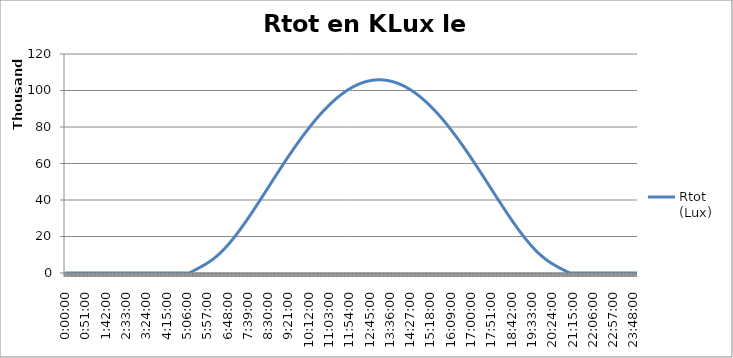
| Category | Rtot
(Lux) |
|---|---|
| 0.0 | 0 |
| 0.0006944444444444445 | 0 |
| 0.001388888888888889 | 0 |
| 0.0020833333333333333 | 0 |
| 0.002777777777777778 | 0 |
| 0.0034722222222222225 | 0 |
| 0.004166666666666667 | 0 |
| 0.004861111111111111 | 0 |
| 0.005555555555555556 | 0 |
| 0.00625 | 0 |
| 0.006944444444444445 | 0 |
| 0.0076388888888888895 | 0 |
| 0.008333333333333333 | 0 |
| 0.009027777777777777 | 0 |
| 0.00972222222222222 | 0 |
| 0.010416666666666664 | 0 |
| 0.011111111111111108 | 0 |
| 0.011805555555555552 | 0 |
| 0.012499999999999995 | 0 |
| 0.01319444444444444 | 0 |
| 0.013888888888888883 | 0 |
| 0.014583333333333327 | 0 |
| 0.01527777777777777 | 0 |
| 0.015972222222222214 | 0 |
| 0.01666666666666666 | 0 |
| 0.017361111111111105 | 0 |
| 0.01805555555555555 | 0 |
| 0.018749999999999996 | 0 |
| 0.01944444444444444 | 0 |
| 0.020138888888888887 | 0 |
| 0.020833333333333332 | 0 |
| 0.021527777777777778 | 0 |
| 0.022222222222222223 | 0 |
| 0.02291666666666667 | 0 |
| 0.023611111111111114 | 0 |
| 0.02430555555555556 | 0 |
| 0.025000000000000005 | 0 |
| 0.02569444444444445 | 0 |
| 0.026388888888888896 | 0 |
| 0.02708333333333334 | 0 |
| 0.027777777777777787 | 0 |
| 0.028472222222222232 | 0 |
| 0.029166666666666678 | 0 |
| 0.029861111111111123 | 0 |
| 0.03055555555555557 | 0 |
| 0.031250000000000014 | 0 |
| 0.031944444444444456 | 0 |
| 0.0326388888888889 | 0 |
| 0.03333333333333334 | 0 |
| 0.03402777777777778 | 0 |
| 0.034722222222222224 | 0 |
| 0.035416666666666666 | 0 |
| 0.03611111111111111 | 0 |
| 0.03680555555555555 | 0 |
| 0.03749999999999999 | 0 |
| 0.038194444444444434 | 0 |
| 0.038888888888888876 | 0 |
| 0.03958333333333332 | 0 |
| 0.04027777777777776 | 0 |
| 0.0409722222222222 | 0 |
| 0.041666666666666644 | 0 |
| 0.042361111111111086 | 0 |
| 0.04305555555555553 | 0 |
| 0.04374999999999997 | 0 |
| 0.04444444444444441 | 0 |
| 0.04513888888888885 | 0 |
| 0.045833333333333295 | 0 |
| 0.04652777777777774 | 0 |
| 0.04722222222222218 | 0 |
| 0.04791666666666662 | 0 |
| 0.04861111111111106 | 0 |
| 0.049305555555555505 | 0 |
| 0.04999999999999995 | 0 |
| 0.05069444444444439 | 0 |
| 0.05138888888888883 | 0 |
| 0.05208333333333327 | 0 |
| 0.052777777777777715 | 0 |
| 0.05347222222222216 | 0 |
| 0.0541666666666666 | 0 |
| 0.05486111111111104 | 0 |
| 0.05555555555555548 | 0 |
| 0.056249999999999925 | 0 |
| 0.05694444444444437 | 0 |
| 0.05763888888888881 | 0 |
| 0.05833333333333325 | 0 |
| 0.05902777777777769 | 0 |
| 0.059722222222222135 | 0 |
| 0.06041666666666658 | 0 |
| 0.06111111111111102 | 0 |
| 0.06180555555555546 | 0 |
| 0.0624999999999999 | 0 |
| 0.06319444444444434 | 0 |
| 0.06388888888888879 | 0 |
| 0.06458333333333323 | 0 |
| 0.06527777777777767 | 0 |
| 0.06597222222222211 | 0 |
| 0.06666666666666655 | 0 |
| 0.067361111111111 | 0 |
| 0.06805555555555544 | 0 |
| 0.06874999999999988 | 0 |
| 0.06944444444444432 | 0 |
| 0.07013888888888876 | 0 |
| 0.0708333333333332 | 0 |
| 0.07152777777777765 | 0 |
| 0.07222222222222209 | 0 |
| 0.07291666666666653 | 0 |
| 0.07361111111111097 | 0 |
| 0.07430555555555542 | 0 |
| 0.07499999999999986 | 0 |
| 0.0756944444444443 | 0 |
| 0.07638888888888874 | 0 |
| 0.07708333333333318 | 0 |
| 0.07777777777777763 | 0 |
| 0.07847222222222207 | 0 |
| 0.07916666666666651 | 0 |
| 0.07986111111111095 | 0 |
| 0.0805555555555554 | 0 |
| 0.08124999999999984 | 0 |
| 0.08194444444444428 | 0 |
| 0.08263888888888872 | 0 |
| 0.08333333333333316 | 0 |
| 0.0840277777777776 | 0 |
| 0.08472222222222205 | 0 |
| 0.08541666666666649 | 0 |
| 0.08611111111111093 | 0 |
| 0.08680555555555537 | 0 |
| 0.08749999999999981 | 0 |
| 0.08819444444444426 | 0 |
| 0.0888888888888887 | 0 |
| 0.08958333333333314 | 0 |
| 0.09027777777777758 | 0 |
| 0.09097222222222202 | 0 |
| 0.09166666666666647 | 0 |
| 0.09236111111111091 | 0 |
| 0.09305555555555535 | 0 |
| 0.09374999999999979 | 0 |
| 0.09444444444444423 | 0 |
| 0.09513888888888868 | 0 |
| 0.09583333333333312 | 0 |
| 0.09652777777777756 | 0 |
| 0.097222222222222 | 0 |
| 0.09791666666666644 | 0 |
| 0.09861111111111089 | 0 |
| 0.09930555555555533 | 0 |
| 0.09999999999999977 | 0 |
| 0.10069444444444421 | 0 |
| 0.10138888888888865 | 0 |
| 0.1020833333333331 | 0 |
| 0.10277777777777754 | 0 |
| 0.10347222222222198 | 0 |
| 0.10416666666666642 | 0 |
| 0.10486111111111086 | 0 |
| 0.1055555555555553 | 0 |
| 0.10624999999999975 | 0 |
| 0.10694444444444419 | 0 |
| 0.10763888888888863 | 0 |
| 0.10833333333333307 | 0 |
| 0.10902777777777752 | 0 |
| 0.10972222222222196 | 0 |
| 0.1104166666666664 | 0 |
| 0.11111111111111084 | 0 |
| 0.11180555555555528 | 0 |
| 0.11249999999999973 | 0 |
| 0.11319444444444417 | 0 |
| 0.11388888888888861 | 0 |
| 0.11458333333333305 | 0 |
| 0.1152777777777775 | 0 |
| 0.11597222222222194 | 0 |
| 0.11666666666666638 | 0 |
| 0.11736111111111082 | 0 |
| 0.11805555555555526 | 0 |
| 0.1187499999999997 | 0 |
| 0.11944444444444414 | 0 |
| 0.12013888888888859 | 0 |
| 0.12083333333333303 | 0 |
| 0.12152777777777747 | 0 |
| 0.12222222222222191 | 0 |
| 0.12291666666666635 | 0 |
| 0.1236111111111108 | 0 |
| 0.12430555555555524 | 0 |
| 0.12499999999999968 | 0 |
| 0.12569444444444414 | 0 |
| 0.12638888888888858 | 0 |
| 0.12708333333333302 | 0 |
| 0.12777777777777746 | 0 |
| 0.1284722222222219 | 0 |
| 0.12916666666666635 | 0 |
| 0.1298611111111108 | 0 |
| 0.13055555555555523 | 0 |
| 0.13124999999999967 | 0 |
| 0.13194444444444411 | 0 |
| 0.13263888888888856 | 0 |
| 0.133333333333333 | 0 |
| 0.13402777777777744 | 0 |
| 0.13472222222222188 | 0 |
| 0.13541666666666632 | 0 |
| 0.13611111111111077 | 0 |
| 0.1368055555555552 | 0 |
| 0.13749999999999965 | 0 |
| 0.1381944444444441 | 0 |
| 0.13888888888888853 | 0 |
| 0.13958333333333298 | 0 |
| 0.14027777777777742 | 0 |
| 0.14097222222222186 | 0 |
| 0.1416666666666663 | 0 |
| 0.14236111111111074 | 0 |
| 0.14305555555555519 | 0 |
| 0.14374999999999963 | 0 |
| 0.14444444444444407 | 0 |
| 0.1451388888888885 | 0 |
| 0.14583333333333295 | 0 |
| 0.1465277777777774 | 0 |
| 0.14722222222222184 | 0 |
| 0.14791666666666628 | 0 |
| 0.14861111111111072 | 0 |
| 0.14930555555555516 | 0 |
| 0.1499999999999996 | 0 |
| 0.15069444444444405 | 0 |
| 0.1513888888888885 | 0 |
| 0.15208333333333293 | 0 |
| 0.15277777777777737 | 0 |
| 0.15347222222222182 | 0 |
| 0.15416666666666626 | 0 |
| 0.1548611111111107 | 0 |
| 0.15555555555555514 | 0 |
| 0.15624999999999958 | 0 |
| 0.15694444444444403 | 0 |
| 0.15763888888888847 | 0 |
| 0.1583333333333329 | 0 |
| 0.15902777777777735 | 0 |
| 0.1597222222222218 | 0 |
| 0.16041666666666624 | 0 |
| 0.16111111111111068 | 0 |
| 0.16180555555555512 | 0 |
| 0.16249999999999956 | 0 |
| 0.163194444444444 | 0 |
| 0.16388888888888845 | 0 |
| 0.1645833333333329 | 0 |
| 0.16527777777777733 | 0 |
| 0.16597222222222177 | 0 |
| 0.1666666666666662 | 0 |
| 0.16736111111111066 | 0 |
| 0.1680555555555551 | 0 |
| 0.16874999999999954 | 0 |
| 0.16944444444444398 | 0 |
| 0.17013888888888842 | 0 |
| 0.17083333333333287 | 0 |
| 0.1715277777777773 | 0 |
| 0.17222222222222175 | 0 |
| 0.1729166666666662 | 0 |
| 0.17361111111111063 | 0 |
| 0.17430555555555508 | 0 |
| 0.17499999999999952 | 0 |
| 0.17569444444444396 | 0 |
| 0.1763888888888884 | 0 |
| 0.17708333333333284 | 0 |
| 0.17777777777777728 | 0 |
| 0.17847222222222173 | 0 |
| 0.17916666666666617 | 0 |
| 0.1798611111111106 | 0 |
| 0.18055555555555505 | 0 |
| 0.1812499999999995 | 0 |
| 0.18194444444444394 | 0 |
| 0.18263888888888838 | 0 |
| 0.18333333333333282 | 0 |
| 0.18402777777777726 | 0 |
| 0.1847222222222217 | 0 |
| 0.18541666666666615 | 0 |
| 0.1861111111111106 | 0 |
| 0.18680555555555503 | 0 |
| 0.18749999999999947 | 0 |
| 0.18819444444444391 | 0 |
| 0.18888888888888836 | 0 |
| 0.1895833333333328 | 0 |
| 0.19027777777777724 | 0 |
| 0.19097222222222168 | 0 |
| 0.19166666666666612 | 0 |
| 0.19236111111111057 | 0 |
| 0.193055555555555 | 0 |
| 0.19374999999999945 | 0 |
| 0.1944444444444439 | 0 |
| 0.19513888888888833 | 0 |
| 0.19583333333333278 | 0 |
| 0.19652777777777722 | 0 |
| 0.19722222222222166 | 0 |
| 0.1979166666666661 | 0 |
| 0.19861111111111054 | 0 |
| 0.199305555555555 | 0 |
| 0.19999999999999943 | 0 |
| 0.20069444444444387 | 0 |
| 0.2013888888888883 | 0 |
| 0.20208333333333275 | 0 |
| 0.2027777777777772 | 0 |
| 0.20347222222222164 | 0 |
| 0.20416666666666608 | 0 |
| 0.20486111111111052 | 0 |
| 0.20555555555555496 | 0 |
| 0.2062499999999994 | 0 |
| 0.20694444444444385 | 0 |
| 0.2076388888888883 | 0 |
| 0.20833333333333273 | 0 |
| 0.20902777777777717 | 0 |
| 0.20972222222222162 | 0 |
| 0.21041666666666606 | 0 |
| 0.2111111111111105 | 0 |
| 0.21180555555555494 | 0 |
| 0.21249999999999938 | 0 |
| 0.21319444444444383 | 0 |
| 0.21388888888888827 | 0 |
| 0.2145833333333327 | 0 |
| 0.21527777777777715 | 0 |
| 0.2159722222222216 | 0 |
| 0.21666666666666604 | 86.975 |
| 0.21736111111111048 | 195.812 |
| 0.21805555555555492 | 304.914 |
| 0.21874999999999936 | 414.279 |
| 0.2194444444444438 | 523.903 |
| 0.22013888888888825 | 633.787 |
| 0.2208333333333327 | 743.927 |
| 0.22152777777777713 | 854.322 |
| 0.22222222222222157 | 964.97 |
| 0.222916666666666 | 1075.871 |
| 0.22361111111111046 | 1187.025 |
| 0.2243055555555549 | 1298.43 |
| 0.22499999999999934 | 1410.089 |
| 0.22569444444444378 | 1522.004 |
| 0.22638888888888822 | 1634.18 |
| 0.22708333333333267 | 1746.62 |
| 0.2277777777777771 | 1859.335 |
| 0.22847222222222155 | 1972.334 |
| 0.229166666666666 | 2085.63 |
| 0.22986111111111043 | 2199.24 |
| 0.23055555555555488 | 2313.183 |
| 0.23124999999999932 | 2427.483 |
| 0.23194444444444376 | 2542.166 |
| 0.2326388888888882 | 2657.262 |
| 0.23333333333333264 | 2772.806 |
| 0.23402777777777709 | 2888.836 |
| 0.23472222222222153 | 3005.392 |
| 0.23541666666666597 | 3122.519 |
| 0.2361111111111104 | 3240.265 |
| 0.23680555555555485 | 3358.681 |
| 0.2374999999999993 | 3477.82 |
| 0.23819444444444374 | 3597.738 |
| 0.23888888888888818 | 3718.491 |
| 0.23958333333333262 | 3840.139 |
| 0.24027777777777706 | 3962.742 |
| 0.2409722222222215 | 4086.361 |
| 0.24166666666666595 | 4211.059 |
| 0.2423611111111104 | 4336.897 |
| 0.24305555555555483 | 4463.937 |
| 0.24374999999999927 | 4592.24 |
| 0.24444444444444371 | 4721.868 |
| 0.24513888888888816 | 4852.88 |
| 0.2458333333333326 | 4985.335 |
| 0.24652777777777704 | 5119.291 |
| 0.24722222222222148 | 5254.804 |
| 0.24791666666666592 | 5391.928 |
| 0.24861111111111037 | 5530.715 |
| 0.2493055555555548 | 5671.217 |
| 0.24999999999999925 | 5813.48 |
| 0.2506944444444437 | 5957.553 |
| 0.25138888888888816 | 6103.478 |
| 0.2520833333333326 | 6251.298 |
| 0.25277777777777705 | 6401.053 |
| 0.2534722222222215 | 6552.779 |
| 0.25416666666666593 | 6706.511 |
| 0.25486111111111037 | 6862.283 |
| 0.2555555555555548 | 7020.125 |
| 0.25624999999999926 | 7180.065 |
| 0.2569444444444437 | 7342.129 |
| 0.25763888888888814 | 7506.34 |
| 0.2583333333333326 | 7672.72 |
| 0.259027777777777 | 7841.289 |
| 0.25972222222222147 | 8012.064 |
| 0.2604166666666659 | 8185.06 |
| 0.26111111111111035 | 8360.29 |
| 0.2618055555555548 | 8537.768 |
| 0.26249999999999923 | 8717.501 |
| 0.2631944444444437 | 8899.498 |
| 0.2638888888888881 | 9083.766 |
| 0.26458333333333256 | 9270.308 |
| 0.265277777777777 | 9459.129 |
| 0.26597222222222144 | 9650.229 |
| 0.2666666666666659 | 9843.608 |
| 0.26736111111111033 | 10039.267 |
| 0.26805555555555477 | 10237.201 |
| 0.2687499999999992 | 10437.406 |
| 0.26944444444444365 | 10639.879 |
| 0.2701388888888881 | 10844.613 |
| 0.27083333333333254 | 11051.599 |
| 0.271527777777777 | 11260.831 |
| 0.2722222222222214 | 11472.298 |
| 0.27291666666666586 | 11685.991 |
| 0.2736111111111103 | 11901.898 |
| 0.27430555555555475 | 12120.007 |
| 0.2749999999999992 | 12340.306 |
| 0.27569444444444363 | 12562.781 |
| 0.2763888888888881 | 12787.417 |
| 0.2770833333333325 | 13014.201 |
| 0.27777777777777696 | 13243.115 |
| 0.2784722222222214 | 13474.145 |
| 0.27916666666666584 | 13707.273 |
| 0.2798611111111103 | 13942.483 |
| 0.2805555555555547 | 14179.757 |
| 0.28124999999999917 | 14419.076 |
| 0.2819444444444436 | 14660.423 |
| 0.28263888888888805 | 14903.777 |
| 0.2833333333333325 | 15149.121 |
| 0.28402777777777694 | 15396.435 |
| 0.2847222222222214 | 15645.698 |
| 0.2854166666666658 | 15896.89 |
| 0.28611111111111026 | 16149.992 |
| 0.2868055555555547 | 16404.982 |
| 0.28749999999999915 | 16661.839 |
| 0.2881944444444436 | 16920.542 |
| 0.28888888888888803 | 17181.071 |
| 0.28958333333333247 | 17443.404 |
| 0.2902777777777769 | 17707.518 |
| 0.29097222222222136 | 17973.393 |
| 0.2916666666666658 | 18241.007 |
| 0.29236111111111024 | 18510.338 |
| 0.2930555555555547 | 18781.363 |
| 0.2937499999999991 | 19054.061 |
| 0.29444444444444356 | 19328.41 |
| 0.295138888888888 | 19604.387 |
| 0.29583333333333245 | 19881.97 |
| 0.2965277777777769 | 20161.137 |
| 0.29722222222222133 | 20441.867 |
| 0.2979166666666658 | 20724.136 |
| 0.2986111111111102 | 21007.922 |
| 0.29930555555555466 | 21293.203 |
| 0.2999999999999991 | 21579.957 |
| 0.30069444444444354 | 21868.163 |
| 0.301388888888888 | 22157.796 |
| 0.3020833333333324 | 22448.836 |
| 0.30277777777777687 | 22741.261 |
| 0.3034722222222213 | 23035.048 |
| 0.30416666666666575 | 23330.176 |
| 0.3048611111111102 | 23626.622 |
| 0.30555555555555464 | 23924.365 |
| 0.3062499999999991 | 24223.383 |
| 0.3069444444444435 | 24523.655 |
| 0.30763888888888796 | 24825.158 |
| 0.3083333333333324 | 25127.871 |
| 0.30902777777777685 | 25431.773 |
| 0.3097222222222213 | 25736.843 |
| 0.31041666666666573 | 26043.059 |
| 0.3111111111111102 | 26350.4 |
| 0.3118055555555546 | 26658.845 |
| 0.31249999999999906 | 26968.373 |
| 0.3131944444444435 | 27278.963 |
| 0.31388888888888794 | 27590.595 |
| 0.3145833333333324 | 27903.247 |
| 0.3152777777777768 | 28216.899 |
| 0.31597222222222127 | 28531.531 |
| 0.3166666666666657 | 28847.123 |
| 0.31736111111111015 | 29163.653 |
| 0.3180555555555546 | 29481.103 |
| 0.31874999999999903 | 29799.451 |
| 0.3194444444444435 | 30118.678 |
| 0.3201388888888879 | 30438.765 |
| 0.32083333333333236 | 30759.692 |
| 0.3215277777777768 | 31081.438 |
| 0.32222222222222124 | 31403.985 |
| 0.3229166666666657 | 31727.313 |
| 0.32361111111111013 | 32051.403 |
| 0.32430555555555457 | 32376.236 |
| 0.324999999999999 | 32701.793 |
| 0.32569444444444345 | 33028.054 |
| 0.3263888888888879 | 33355.002 |
| 0.32708333333333234 | 33682.617 |
| 0.3277777777777768 | 34010.882 |
| 0.3284722222222212 | 34339.776 |
| 0.32916666666666566 | 34669.283 |
| 0.3298611111111101 | 34999.384 |
| 0.33055555555555455 | 35330.061 |
| 0.331249999999999 | 35661.296 |
| 0.33194444444444343 | 35993.071 |
| 0.3326388888888879 | 36325.367 |
| 0.3333333333333323 | 36658.169 |
| 0.33402777777777676 | 36991.457 |
| 0.3347222222222212 | 37325.216 |
| 0.33541666666666564 | 37659.426 |
| 0.3361111111111101 | 37994.071 |
| 0.3368055555555545 | 38329.134 |
| 0.33749999999999897 | 38664.599 |
| 0.3381944444444434 | 39000.447 |
| 0.33888888888888785 | 39336.662 |
| 0.3395833333333323 | 39673.228 |
| 0.34027777777777674 | 40010.128 |
| 0.3409722222222212 | 40347.345 |
| 0.3416666666666656 | 40684.863 |
| 0.34236111111111006 | 41022.667 |
| 0.3430555555555545 | 41360.738 |
| 0.34374999999999895 | 41699.063 |
| 0.3444444444444434 | 42037.623 |
| 0.34513888888888783 | 42376.405 |
| 0.34583333333333227 | 42715.391 |
| 0.3465277777777767 | 43054.567 |
| 0.34722222222222116 | 43393.916 |
| 0.3479166666666656 | 43733.424 |
| 0.34861111111111004 | 44073.074 |
| 0.3493055555555545 | 44412.852 |
| 0.3499999999999989 | 44752.742 |
| 0.35069444444444337 | 45092.729 |
| 0.3513888888888878 | 45432.799 |
| 0.35208333333333225 | 45772.936 |
| 0.3527777777777767 | 46113.125 |
| 0.35347222222222113 | 46453.352 |
| 0.3541666666666656 | 46793.602 |
| 0.35486111111111 | 47133.86 |
| 0.35555555555555446 | 47474.113 |
| 0.3562499999999989 | 47814.345 |
| 0.35694444444444334 | 48154.542 |
| 0.3576388888888878 | 48494.691 |
| 0.3583333333333322 | 48834.776 |
| 0.35902777777777667 | 49174.785 |
| 0.3597222222222211 | 49514.703 |
| 0.36041666666666555 | 49854.516 |
| 0.36111111111111 | 50194.21 |
| 0.36180555555555444 | 50533.772 |
| 0.3624999999999989 | 50873.188 |
| 0.3631944444444433 | 51212.445 |
| 0.36388888888888776 | 51551.528 |
| 0.3645833333333322 | 51890.426 |
| 0.36527777777777665 | 52229.124 |
| 0.3659722222222211 | 52567.609 |
| 0.36666666666666553 | 52905.868 |
| 0.36736111111111 | 53243.888 |
| 0.3680555555555544 | 53581.656 |
| 0.36874999999999886 | 53919.159 |
| 0.3694444444444433 | 54256.385 |
| 0.37013888888888774 | 54593.32 |
| 0.3708333333333322 | 54929.952 |
| 0.3715277777777766 | 55266.268 |
| 0.37222222222222107 | 55602.255 |
| 0.3729166666666655 | 55937.902 |
| 0.37361111111110995 | 56273.196 |
| 0.3743055555555544 | 56608.125 |
| 0.37499999999999883 | 56942.675 |
| 0.3756944444444433 | 57276.836 |
| 0.3763888888888877 | 57610.595 |
| 0.37708333333333216 | 57943.94 |
| 0.3777777777777766 | 58276.858 |
| 0.37847222222222104 | 58609.339 |
| 0.3791666666666655 | 58941.37 |
| 0.37986111111110993 | 59272.94 |
| 0.38055555555555437 | 59604.037 |
| 0.3812499999999988 | 59934.648 |
| 0.38194444444444325 | 60264.764 |
| 0.3826388888888877 | 60594.371 |
| 0.38333333333333214 | 60923.46 |
| 0.3840277777777766 | 61252.017 |
| 0.384722222222221 | 61580.033 |
| 0.38541666666666546 | 61907.496 |
| 0.3861111111111099 | 62234.394 |
| 0.38680555555555435 | 62560.717 |
| 0.3874999999999988 | 62886.453 |
| 0.38819444444444323 | 63211.592 |
| 0.3888888888888877 | 63536.123 |
| 0.3895833333333321 | 63860.034 |
| 0.39027777777777656 | 64183.316 |
| 0.390972222222221 | 64505.957 |
| 0.39166666666666544 | 64827.946 |
| 0.3923611111111099 | 65149.273 |
| 0.3930555555555543 | 65469.928 |
| 0.39374999999999877 | 65789.9 |
| 0.3944444444444432 | 66109.178 |
| 0.39513888888888765 | 66427.753 |
| 0.3958333333333321 | 66745.613 |
| 0.39652777777777654 | 67062.749 |
| 0.397222222222221 | 67379.151 |
| 0.3979166666666654 | 67694.807 |
| 0.39861111111110986 | 68009.709 |
| 0.3993055555555543 | 68323.846 |
| 0.39999999999999875 | 68637.209 |
| 0.4006944444444432 | 68949.786 |
| 0.40138888888888763 | 69261.57 |
| 0.40208333333333207 | 69572.548 |
| 0.4027777777777765 | 69882.713 |
| 0.40347222222222096 | 70192.054 |
| 0.4041666666666654 | 70500.562 |
| 0.40486111111110984 | 70808.227 |
| 0.4055555555555543 | 71115.039 |
| 0.4062499999999987 | 71420.99 |
| 0.40694444444444317 | 71726.069 |
| 0.4076388888888876 | 72030.267 |
| 0.40833333333333205 | 72333.576 |
| 0.4090277777777765 | 72635.985 |
| 0.40972222222222093 | 72937.486 |
| 0.4104166666666654 | 73238.07 |
| 0.4111111111111098 | 73537.727 |
| 0.41180555555555426 | 73836.448 |
| 0.4124999999999987 | 74134.224 |
| 0.41319444444444314 | 74431.047 |
| 0.4138888888888876 | 74726.908 |
| 0.414583333333332 | 75021.797 |
| 0.41527777777777647 | 75315.707 |
| 0.4159722222222209 | 75608.627 |
| 0.41666666666666535 | 75900.551 |
| 0.4173611111111098 | 76191.468 |
| 0.41805555555555424 | 76481.371 |
| 0.4187499999999987 | 76770.25 |
| 0.4194444444444431 | 77058.098 |
| 0.42013888888888756 | 77344.906 |
| 0.420833333333332 | 77630.666 |
| 0.42152777777777645 | 77915.369 |
| 0.4222222222222209 | 78199.008 |
| 0.42291666666666533 | 78481.573 |
| 0.4236111111111098 | 78763.057 |
| 0.4243055555555542 | 79043.451 |
| 0.42499999999999866 | 79322.748 |
| 0.4256944444444431 | 79600.94 |
| 0.42638888888888754 | 79878.018 |
| 0.427083333333332 | 80153.975 |
| 0.4277777777777764 | 80428.803 |
| 0.42847222222222087 | 80702.494 |
| 0.4291666666666653 | 80975.04 |
| 0.42986111111110975 | 81246.433 |
| 0.4305555555555542 | 81516.666 |
| 0.43124999999999863 | 81785.732 |
| 0.4319444444444431 | 82053.622 |
| 0.4326388888888875 | 82320.329 |
| 0.43333333333333196 | 82585.846 |
| 0.4340277777777764 | 82850.165 |
| 0.43472222222222084 | 83113.279 |
| 0.4354166666666653 | 83375.181 |
| 0.43611111111110973 | 83635.863 |
| 0.43680555555555417 | 83895.317 |
| 0.4374999999999986 | 84153.538 |
| 0.43819444444444305 | 84410.517 |
| 0.4388888888888875 | 84666.247 |
| 0.43958333333333194 | 84920.723 |
| 0.4402777777777764 | 85173.935 |
| 0.4409722222222208 | 85425.878 |
| 0.44166666666666526 | 85676.545 |
| 0.4423611111111097 | 85925.929 |
| 0.44305555555555415 | 86174.022 |
| 0.4437499999999986 | 86420.819 |
| 0.44444444444444303 | 86666.312 |
| 0.4451388888888875 | 86910.494 |
| 0.4458333333333319 | 87153.36 |
| 0.44652777777777636 | 87394.903 |
| 0.4472222222222208 | 87635.116 |
| 0.44791666666666524 | 87873.992 |
| 0.4486111111111097 | 88111.525 |
| 0.4493055555555541 | 88347.709 |
| 0.44999999999999857 | 88582.537 |
| 0.450694444444443 | 88816.003 |
| 0.45138888888888745 | 89048.101 |
| 0.4520833333333319 | 89278.825 |
| 0.45277777777777634 | 89508.168 |
| 0.4534722222222208 | 89736.124 |
| 0.4541666666666652 | 89962.687 |
| 0.45486111111110966 | 90187.852 |
| 0.4555555555555541 | 90411.612 |
| 0.45624999999999855 | 90633.961 |
| 0.456944444444443 | 90854.893 |
| 0.45763888888888743 | 91074.403 |
| 0.45833333333333187 | 91292.484 |
| 0.4590277777777763 | 91509.131 |
| 0.45972222222222076 | 91724.339 |
| 0.4604166666666652 | 91938.101 |
| 0.46111111111110964 | 92150.412 |
| 0.4618055555555541 | 92361.266 |
| 0.4624999999999985 | 92570.658 |
| 0.46319444444444297 | 92778.583 |
| 0.4638888888888874 | 92985.034 |
| 0.46458333333333185 | 93190.006 |
| 0.4652777777777763 | 93393.495 |
| 0.46597222222222073 | 93595.495 |
| 0.4666666666666652 | 93796 |
| 0.4673611111111096 | 93995.005 |
| 0.46805555555555406 | 94192.506 |
| 0.4687499999999985 | 94388.496 |
| 0.46944444444444294 | 94582.972 |
| 0.4701388888888874 | 94775.927 |
| 0.4708333333333318 | 94967.357 |
| 0.47152777777777627 | 95157.257 |
| 0.4722222222222207 | 95345.622 |
| 0.47291666666666515 | 95532.448 |
| 0.4736111111111096 | 95717.728 |
| 0.47430555555555404 | 95901.459 |
| 0.4749999999999985 | 96083.637 |
| 0.4756944444444429 | 96264.255 |
| 0.47638888888888736 | 96443.31 |
| 0.4770833333333318 | 96620.796 |
| 0.47777777777777625 | 96796.71 |
| 0.4784722222222207 | 96971.047 |
| 0.47916666666666513 | 97143.803 |
| 0.4798611111111096 | 97314.972 |
| 0.480555555555554 | 97484.551 |
| 0.48124999999999846 | 97652.535 |
| 0.4819444444444429 | 97818.921 |
| 0.48263888888888734 | 97983.703 |
| 0.4833333333333318 | 98146.878 |
| 0.4840277777777762 | 98308.441 |
| 0.48472222222222067 | 98468.388 |
| 0.4854166666666651 | 98626.716 |
| 0.48611111111110955 | 98783.42 |
| 0.486805555555554 | 98938.496 |
| 0.48749999999999843 | 99091.941 |
| 0.4881944444444429 | 99243.75 |
| 0.4888888888888873 | 99393.92 |
| 0.48958333333333176 | 99542.447 |
| 0.4902777777777762 | 99689.326 |
| 0.49097222222222064 | 99834.555 |
| 0.4916666666666651 | 99978.13 |
| 0.49236111111110953 | 100120.047 |
| 0.49305555555555397 | 100260.302 |
| 0.4937499999999984 | 100398.893 |
| 0.49444444444444285 | 100535.815 |
| 0.4951388888888873 | 100671.065 |
| 0.49583333333333174 | 100804.64 |
| 0.4965277777777762 | 100936.536 |
| 0.4972222222222206 | 101066.75 |
| 0.49791666666666506 | 101195.278 |
| 0.4986111111111095 | 101322.119 |
| 0.49930555555555395 | 101447.267 |
| 0.4999999999999984 | 101570.721 |
| 0.5006944444444429 | 101692.477 |
| 0.5013888888888873 | 101812.533 |
| 0.5020833333333318 | 101930.884 |
| 0.5027777777777762 | 102047.528 |
| 0.5034722222222207 | 102162.463 |
| 0.5041666666666651 | 102275.685 |
| 0.5048611111111095 | 102387.191 |
| 0.505555555555554 | 102496.98 |
| 0.5062499999999984 | 102605.047 |
| 0.5069444444444429 | 102711.391 |
| 0.5076388888888873 | 102816.008 |
| 0.5083333333333317 | 102918.897 |
| 0.5090277777777762 | 103020.054 |
| 0.5097222222222206 | 103119.477 |
| 0.5104166666666651 | 103217.164 |
| 0.5111111111111095 | 103313.111 |
| 0.511805555555554 | 103407.318 |
| 0.5124999999999984 | 103499.781 |
| 0.5131944444444428 | 103590.498 |
| 0.5138888888888873 | 103679.467 |
| 0.5145833333333317 | 103766.686 |
| 0.5152777777777762 | 103852.152 |
| 0.5159722222222206 | 103935.864 |
| 0.516666666666665 | 104017.819 |
| 0.5173611111111095 | 104098.015 |
| 0.5180555555555539 | 104176.451 |
| 0.5187499999999984 | 104253.124 |
| 0.5194444444444428 | 104328.032 |
| 0.5201388888888873 | 104401.175 |
| 0.5208333333333317 | 104472.549 |
| 0.5215277777777761 | 104542.153 |
| 0.5222222222222206 | 104609.985 |
| 0.522916666666665 | 104676.044 |
| 0.5236111111111095 | 104740.329 |
| 0.5243055555555539 | 104802.836 |
| 0.5249999999999984 | 104863.566 |
| 0.5256944444444428 | 104922.516 |
| 0.5263888888888872 | 104979.685 |
| 0.5270833333333317 | 105035.072 |
| 0.5277777777777761 | 105088.675 |
| 0.5284722222222206 | 105140.493 |
| 0.529166666666665 | 105190.524 |
| 0.5298611111111095 | 105238.768 |
| 0.5305555555555539 | 105285.224 |
| 0.5312499999999983 | 105329.889 |
| 0.5319444444444428 | 105372.763 |
| 0.5326388888888872 | 105413.845 |
| 0.5333333333333317 | 105453.134 |
| 0.5340277777777761 | 105490.629 |
| 0.5347222222222205 | 105526.329 |
| 0.535416666666665 | 105560.233 |
| 0.5361111111111094 | 105592.341 |
| 0.5368055555555539 | 105622.651 |
| 0.5374999999999983 | 105651.162 |
| 0.5381944444444428 | 105677.875 |
| 0.5388888888888872 | 105702.788 |
| 0.5395833333333316 | 105725.902 |
| 0.5402777777777761 | 105747.214 |
| 0.5409722222222205 | 105766.725 |
| 0.541666666666665 | 105784.434 |
| 0.5423611111111094 | 105800.341 |
| 0.5430555555555538 | 105814.446 |
| 0.5437499999999983 | 105826.748 |
| 0.5444444444444427 | 105837.246 |
| 0.5451388888888872 | 105845.941 |
| 0.5458333333333316 | 105852.832 |
| 0.5465277777777761 | 105857.92 |
| 0.5472222222222205 | 105861.203 |
| 0.5479166666666649 | 105862.683 |
| 0.5486111111111094 | 105862.358 |
| 0.5493055555555538 | 105860.229 |
| 0.5499999999999983 | 105856.296 |
| 0.5506944444444427 | 105850.559 |
| 0.5513888888888872 | 105843.019 |
| 0.5520833333333316 | 105833.674 |
| 0.552777777777776 | 105822.527 |
| 0.5534722222222205 | 105809.576 |
| 0.5541666666666649 | 105794.823 |
| 0.5548611111111094 | 105778.267 |
| 0.5555555555555538 | 105759.909 |
| 0.5562499999999982 | 105739.749 |
| 0.5569444444444427 | 105717.788 |
| 0.5576388888888871 | 105694.027 |
| 0.5583333333333316 | 105668.466 |
| 0.559027777777776 | 105641.105 |
| 0.5597222222222205 | 105611.946 |
| 0.5604166666666649 | 105580.989 |
| 0.5611111111111093 | 105548.235 |
| 0.5618055555555538 | 105513.684 |
| 0.5624999999999982 | 105477.337 |
| 0.5631944444444427 | 105439.197 |
| 0.5638888888888871 | 105399.262 |
| 0.5645833333333315 | 105357.535 |
| 0.565277777777776 | 105314.016 |
| 0.5659722222222204 | 105268.706 |
| 0.5666666666666649 | 105221.607 |
| 0.5673611111111093 | 105172.719 |
| 0.5680555555555538 | 105122.044 |
| 0.5687499999999982 | 105069.584 |
| 0.5694444444444426 | 105015.338 |
| 0.5701388888888871 | 104959.31 |
| 0.5708333333333315 | 104901.499 |
| 0.571527777777776 | 104841.908 |
| 0.5722222222222204 | 104780.538 |
| 0.5729166666666649 | 104717.391 |
| 0.5736111111111093 | 104652.468 |
| 0.5743055555555537 | 104585.77 |
| 0.5749999999999982 | 104517.299 |
| 0.5756944444444426 | 104447.058 |
| 0.5763888888888871 | 104375.047 |
| 0.5770833333333315 | 104301.269 |
| 0.577777777777776 | 104225.725 |
| 0.5784722222222204 | 104148.417 |
| 0.5791666666666648 | 104069.347 |
| 0.5798611111111093 | 103988.518 |
| 0.5805555555555537 | 103905.93 |
| 0.5812499999999982 | 103821.586 |
| 0.5819444444444426 | 103735.489 |
| 0.582638888888887 | 103647.64 |
| 0.5833333333333315 | 103558.041 |
| 0.5840277777777759 | 103466.695 |
| 0.5847222222222204 | 103373.604 |
| 0.5854166666666648 | 103278.771 |
| 0.5861111111111093 | 103182.197 |
| 0.5868055555555537 | 103083.885 |
| 0.5874999999999981 | 102983.837 |
| 0.5881944444444426 | 102882.056 |
| 0.588888888888887 | 102778.545 |
| 0.5895833333333315 | 102673.306 |
| 0.5902777777777759 | 102566.341 |
| 0.5909722222222203 | 102457.654 |
| 0.5916666666666648 | 102347.247 |
| 0.5923611111111092 | 102235.122 |
| 0.5930555555555537 | 102121.284 |
| 0.5937499999999981 | 102005.733 |
| 0.5944444444444426 | 101888.474 |
| 0.595138888888887 | 101769.509 |
| 0.5958333333333314 | 101648.841 |
| 0.5965277777777759 | 101526.473 |
| 0.5972222222222203 | 101402.409 |
| 0.5979166666666648 | 101276.651 |
| 0.5986111111111092 | 101149.202 |
| 0.5993055555555536 | 101020.067 |
| 0.5999999999999981 | 100889.247 |
| 0.6006944444444425 | 100756.746 |
| 0.601388888888887 | 100622.568 |
| 0.6020833333333314 | 100486.715 |
| 0.6027777777777759 | 100349.192 |
| 0.6034722222222203 | 100210.002 |
| 0.6041666666666647 | 100069.148 |
| 0.6048611111111092 | 99926.634 |
| 0.6055555555555536 | 99782.463 |
| 0.6062499999999981 | 99636.639 |
| 0.6069444444444425 | 99489.166 |
| 0.607638888888887 | 99340.048 |
| 0.6083333333333314 | 99189.288 |
| 0.6090277777777758 | 99036.889 |
| 0.6097222222222203 | 98882.857 |
| 0.6104166666666647 | 98727.194 |
| 0.6111111111111092 | 98569.905 |
| 0.6118055555555536 | 98410.994 |
| 0.612499999999998 | 98250.464 |
| 0.6131944444444425 | 98088.32 |
| 0.6138888888888869 | 97924.566 |
| 0.6145833333333314 | 97759.207 |
| 0.6152777777777758 | 97592.245 |
| 0.6159722222222203 | 97423.686 |
| 0.6166666666666647 | 97253.534 |
| 0.6173611111111091 | 97081.793 |
| 0.6180555555555536 | 96908.468 |
| 0.618749999999998 | 96733.563 |
| 0.6194444444444425 | 96557.082 |
| 0.6201388888888869 | 96379.03 |
| 0.6208333333333313 | 96199.412 |
| 0.6215277777777758 | 96018.232 |
| 0.6222222222222202 | 95835.495 |
| 0.6229166666666647 | 95651.205 |
| 0.6236111111111091 | 95465.368 |
| 0.6243055555555536 | 95277.988 |
| 0.624999999999998 | 95089.07 |
| 0.6256944444444424 | 94898.618 |
| 0.6263888888888869 | 94706.638 |
| 0.6270833333333313 | 94513.135 |
| 0.6277777777777758 | 94318.114 |
| 0.6284722222222202 | 94121.579 |
| 0.6291666666666647 | 93923.536 |
| 0.6298611111111091 | 93723.99 |
| 0.6305555555555535 | 93522.947 |
| 0.631249999999998 | 93320.41 |
| 0.6319444444444424 | 93116.387 |
| 0.6326388888888869 | 92910.881 |
| 0.6333333333333313 | 92703.899 |
| 0.6340277777777757 | 92495.446 |
| 0.6347222222222202 | 92285.527 |
| 0.6354166666666646 | 92074.147 |
| 0.6361111111111091 | 91861.313 |
| 0.6368055555555535 | 91647.03 |
| 0.637499999999998 | 91431.304 |
| 0.6381944444444424 | 91214.14 |
| 0.6388888888888868 | 90995.543 |
| 0.6395833333333313 | 90775.521 |
| 0.6402777777777757 | 90554.078 |
| 0.6409722222222202 | 90331.22 |
| 0.6416666666666646 | 90106.954 |
| 0.642361111111109 | 89881.285 |
| 0.6430555555555535 | 89654.22 |
| 0.6437499999999979 | 89425.764 |
| 0.6444444444444424 | 89195.923 |
| 0.6451388888888868 | 88964.704 |
| 0.6458333333333313 | 88732.113 |
| 0.6465277777777757 | 88498.155 |
| 0.6472222222222201 | 88262.838 |
| 0.6479166666666646 | 88026.168 |
| 0.648611111111109 | 87788.151 |
| 0.6493055555555535 | 87548.793 |
| 0.6499999999999979 | 87308.101 |
| 0.6506944444444424 | 87066.081 |
| 0.6513888888888868 | 86822.74 |
| 0.6520833333333312 | 86578.085 |
| 0.6527777777777757 | 86332.122 |
| 0.6534722222222201 | 86084.857 |
| 0.6541666666666646 | 85836.299 |
| 0.654861111111109 | 85586.452 |
| 0.6555555555555534 | 85335.325 |
| 0.6562499999999979 | 85082.924 |
| 0.6569444444444423 | 84829.257 |
| 0.6576388888888868 | 84574.329 |
| 0.6583333333333312 | 84318.148 |
| 0.6590277777777757 | 84060.721 |
| 0.6597222222222201 | 83802.055 |
| 0.6604166666666645 | 83542.158 |
| 0.661111111111109 | 83281.037 |
| 0.6618055555555534 | 83018.698 |
| 0.6624999999999979 | 82755.149 |
| 0.6631944444444423 | 82490.398 |
| 0.6638888888888868 | 82224.451 |
| 0.6645833333333312 | 81957.317 |
| 0.6652777777777756 | 81689.003 |
| 0.6659722222222201 | 81419.516 |
| 0.6666666666666645 | 81148.865 |
| 0.667361111111109 | 80877.055 |
| 0.6680555555555534 | 80604.096 |
| 0.6687499999999978 | 80329.995 |
| 0.6694444444444423 | 80054.76 |
| 0.6701388888888867 | 79778.399 |
| 0.6708333333333312 | 79500.919 |
| 0.6715277777777756 | 79222.328 |
| 0.6722222222222201 | 78942.635 |
| 0.6729166666666645 | 78661.847 |
| 0.6736111111111089 | 78379.973 |
| 0.6743055555555534 | 78097.021 |
| 0.6749999999999978 | 77812.998 |
| 0.6756944444444423 | 77527.914 |
| 0.6763888888888867 | 77241.776 |
| 0.6770833333333311 | 76954.592 |
| 0.6777777777777756 | 76666.372 |
| 0.67847222222222 | 76377.123 |
| 0.6791666666666645 | 76086.854 |
| 0.6798611111111089 | 75795.574 |
| 0.6805555555555534 | 75503.29 |
| 0.6812499999999978 | 75210.013 |
| 0.6819444444444422 | 74915.75 |
| 0.6826388888888867 | 74620.51 |
| 0.6833333333333311 | 74324.301 |
| 0.6840277777777756 | 74027.134 |
| 0.68472222222222 | 73729.016 |
| 0.6854166666666645 | 73429.957 |
| 0.6861111111111089 | 73129.966 |
| 0.6868055555555533 | 72829.051 |
| 0.6874999999999978 | 72527.222 |
| 0.6881944444444422 | 72224.488 |
| 0.6888888888888867 | 71920.858 |
| 0.6895833333333311 | 71616.341 |
| 0.6902777777777755 | 71310.947 |
| 0.69097222222222 | 71004.686 |
| 0.6916666666666644 | 70697.565 |
| 0.6923611111111089 | 70389.596 |
| 0.6930555555555533 | 70080.787 |
| 0.6937499999999978 | 69771.148 |
| 0.6944444444444422 | 69460.689 |
| 0.6951388888888866 | 69149.42 |
| 0.6958333333333311 | 68837.35 |
| 0.6965277777777755 | 68524.488 |
| 0.69722222222222 | 68210.846 |
| 0.6979166666666644 | 67896.432 |
| 0.6986111111111089 | 67581.257 |
| 0.6993055555555533 | 67265.331 |
| 0.6999999999999977 | 66948.664 |
| 0.7006944444444422 | 66631.266 |
| 0.7013888888888866 | 66313.148 |
| 0.7020833333333311 | 65994.319 |
| 0.7027777777777755 | 65674.789 |
| 0.70347222222222 | 65354.571 |
| 0.7041666666666644 | 65033.672 |
| 0.7048611111111088 | 64712.106 |
| 0.7055555555555533 | 64389.88 |
| 0.7062499999999977 | 64067.008 |
| 0.7069444444444422 | 63743.498 |
| 0.7076388888888866 | 63419.363 |
| 0.708333333333331 | 63094.612 |
| 0.7090277777777755 | 62769.256 |
| 0.7097222222222199 | 62443.308 |
| 0.7104166666666644 | 62116.776 |
| 0.7111111111111088 | 61789.674 |
| 0.7118055555555532 | 61462.011 |
| 0.7124999999999977 | 61133.798 |
| 0.7131944444444421 | 60805.048 |
| 0.7138888888888866 | 60475.772 |
| 0.714583333333331 | 60145.98 |
| 0.7152777777777755 | 59815.685 |
| 0.7159722222222199 | 59484.897 |
| 0.7166666666666643 | 59153.629 |
| 0.7173611111111088 | 58821.892 |
| 0.7180555555555532 | 58489.697 |
| 0.7187499999999977 | 58157.057 |
| 0.7194444444444421 | 57823.984 |
| 0.7201388888888866 | 57490.489 |
| 0.720833333333331 | 57156.584 |
| 0.7215277777777754 | 56822.281 |
| 0.7222222222222199 | 56487.593 |
| 0.7229166666666643 | 56152.532 |
| 0.7236111111111088 | 55817.11 |
| 0.7243055555555532 | 55481.338 |
| 0.7249999999999976 | 55145.231 |
| 0.7256944444444421 | 54808.8 |
| 0.7263888888888865 | 54472.057 |
| 0.727083333333331 | 54135.016 |
| 0.7277777777777754 | 53797.689 |
| 0.7284722222222199 | 53460.089 |
| 0.7291666666666643 | 53122.229 |
| 0.7298611111111087 | 52784.121 |
| 0.7305555555555532 | 52445.779 |
| 0.7312499999999976 | 52107.216 |
| 0.7319444444444421 | 51768.445 |
| 0.7326388888888865 | 51429.479 |
| 0.733333333333331 | 51090.332 |
| 0.7340277777777754 | 50751.016 |
| 0.7347222222222198 | 50411.546 |
| 0.7354166666666643 | 50071.935 |
| 0.7361111111111087 | 49732.196 |
| 0.7368055555555532 | 49392.344 |
| 0.7374999999999976 | 49052.392 |
| 0.738194444444442 | 48712.354 |
| 0.7388888888888865 | 48372.244 |
| 0.7395833333333309 | 48032.076 |
| 0.7402777777777754 | 47691.864 |
| 0.7409722222222198 | 47351.623 |
| 0.7416666666666643 | 47011.367 |
| 0.7423611111111087 | 46671.11 |
| 0.7430555555555531 | 46330.867 |
| 0.7437499999999976 | 45990.652 |
| 0.744444444444442 | 45650.48 |
| 0.7451388888888865 | 45310.365 |
| 0.7458333333333309 | 44970.324 |
| 0.7465277777777753 | 44630.37 |
| 0.7472222222222198 | 44290.518 |
| 0.7479166666666642 | 43950.785 |
| 0.7486111111111087 | 43611.184 |
| 0.7493055555555531 | 43271.732 |
| 0.7499999999999976 | 42932.443 |
| 0.750694444444442 | 42593.334 |
| 0.7513888888888864 | 42254.419 |
| 0.7520833333333309 | 41915.715 |
| 0.7527777777777753 | 41577.238 |
| 0.7534722222222198 | 41239.002 |
| 0.7541666666666642 | 40901.026 |
| 0.7548611111111087 | 40563.323 |
| 0.7555555555555531 | 40225.911 |
| 0.7562499999999975 | 39888.806 |
| 0.756944444444442 | 39552.025 |
| 0.7576388888888864 | 39215.583 |
| 0.7583333333333309 | 38879.498 |
| 0.7590277777777753 | 38543.786 |
| 0.7597222222222197 | 38208.465 |
| 0.7604166666666642 | 37873.55 |
| 0.7611111111111086 | 37539.059 |
| 0.7618055555555531 | 37205.01 |
| 0.7624999999999975 | 36871.419 |
| 0.763194444444442 | 36538.303 |
| 0.7638888888888864 | 36205.682 |
| 0.7645833333333308 | 35873.571 |
| 0.7652777777777753 | 35541.988 |
| 0.7659722222222197 | 35210.952 |
| 0.7666666666666642 | 34880.481 |
| 0.7673611111111086 | 34550.592 |
| 0.768055555555553 | 34221.303 |
| 0.7687499999999975 | 33892.633 |
| 0.7694444444444419 | 33564.6 |
| 0.7701388888888864 | 33237.223 |
| 0.7708333333333308 | 32910.52 |
| 0.7715277777777753 | 32584.51 |
| 0.7722222222222197 | 32259.212 |
| 0.7729166666666641 | 31934.644 |
| 0.7736111111111086 | 31610.826 |
| 0.774305555555553 | 31287.777 |
| 0.7749999999999975 | 30965.516 |
| 0.7756944444444419 | 30644.063 |
| 0.7763888888888864 | 30323.436 |
| 0.7770833333333308 | 30003.657 |
| 0.7777777777777752 | 29684.743 |
| 0.7784722222222197 | 29366.716 |
| 0.7791666666666641 | 29049.595 |
| 0.7798611111111086 | 28733.4 |
| 0.780555555555553 | 28418.152 |
| 0.7812499999999974 | 28103.87 |
| 0.7819444444444419 | 27790.576 |
| 0.7826388888888863 | 27478.289 |
| 0.7833333333333308 | 27167.03 |
| 0.7840277777777752 | 26856.819 |
| 0.7847222222222197 | 26547.679 |
| 0.7854166666666641 | 26239.629 |
| 0.7861111111111085 | 25932.691 |
| 0.786805555555553 | 25626.885 |
| 0.7874999999999974 | 25322.233 |
| 0.7881944444444419 | 25018.756 |
| 0.7888888888888863 | 24716.476 |
| 0.7895833333333308 | 24415.414 |
| 0.7902777777777752 | 24115.591 |
| 0.7909722222222196 | 23817.03 |
| 0.7916666666666641 | 23519.751 |
| 0.7923611111111085 | 23223.777 |
| 0.793055555555553 | 22929.129 |
| 0.7937499999999974 | 22635.83 |
| 0.7944444444444418 | 22343.901 |
| 0.7951388888888863 | 22053.365 |
| 0.7958333333333307 | 21764.243 |
| 0.7965277777777752 | 21476.558 |
| 0.7972222222222196 | 21190.331 |
| 0.797916666666664 | 20905.585 |
| 0.7986111111111085 | 20622.343 |
| 0.7993055555555529 | 20340.626 |
| 0.7999999999999974 | 20060.456 |
| 0.8006944444444418 | 19781.856 |
| 0.8013888888888863 | 19504.849 |
| 0.8020833333333307 | 19229.455 |
| 0.8027777777777751 | 18955.698 |
| 0.8034722222222196 | 18683.6 |
| 0.804166666666664 | 18413.182 |
| 0.8048611111111085 | 18144.467 |
| 0.8055555555555529 | 17877.477 |
| 0.8062499999999974 | 17612.233 |
| 0.8069444444444418 | 17348.758 |
| 0.8076388888888862 | 17087.072 |
| 0.8083333333333307 | 16827.198 |
| 0.8090277777777751 | 16569.156 |
| 0.8097222222222196 | 16312.969 |
| 0.810416666666664 | 16058.657 |
| 0.8111111111111085 | 15806.24 |
| 0.8118055555555529 | 15555.74 |
| 0.8124999999999973 | 15307.176 |
| 0.8131944444444418 | 15060.57 |
| 0.8138888888888862 | 14815.94 |
| 0.8145833333333307 | 14573.305 |
| 0.8152777777777751 | 14332.687 |
| 0.8159722222222195 | 14094.102 |
| 0.816666666666664 | 13857.569 |
| 0.8173611111111084 | 13623.106 |
| 0.8180555555555529 | 13390.732 |
| 0.8187499999999973 | 13160.461 |
| 0.8194444444444418 | 12932.312 |
| 0.8201388888888862 | 12706.3 |
| 0.8208333333333306 | 12482.44 |
| 0.8215277777777751 | 12260.747 |
| 0.8222222222222195 | 12041.235 |
| 0.822916666666664 | 11823.917 |
| 0.8236111111111084 | 11608.806 |
| 0.8243055555555528 | 11395.913 |
| 0.8249999999999973 | 11185.249 |
| 0.8256944444444417 | 10976.825 |
| 0.8263888888888862 | 10770.649 |
| 0.8270833333333306 | 10566.728 |
| 0.8277777777777751 | 10365.071 |
| 0.8284722222222195 | 10165.682 |
| 0.8291666666666639 | 9968.567 |
| 0.8298611111111084 | 9773.729 |
| 0.8305555555555528 | 9581.17 |
| 0.8312499999999973 | 9390.891 |
| 0.8319444444444417 | 9202.891 |
| 0.8326388888888862 | 9017.167 |
| 0.8333333333333306 | 8833.718 |
| 0.834027777777775 | 8652.536 |
| 0.8347222222222195 | 8473.616 |
| 0.8354166666666639 | 8296.949 |
| 0.8361111111111084 | 8122.524 |
| 0.8368055555555528 | 7950.33 |
| 0.8374999999999972 | 7780.351 |
| 0.8381944444444417 | 7612.572 |
| 0.8388888888888861 | 7446.975 |
| 0.8395833333333306 | 7283.54 |
| 0.840277777777775 | 7122.243 |
| 0.8409722222222195 | 6963.062 |
| 0.8416666666666639 | 6805.969 |
| 0.8423611111111083 | 6650.934 |
| 0.8430555555555528 | 6497.928 |
| 0.8437499999999972 | 6346.916 |
| 0.8444444444444417 | 6197.862 |
| 0.8451388888888861 | 6050.729 |
| 0.8458333333333306 | 5905.475 |
| 0.846527777777775 | 5762.059 |
| 0.8472222222222194 | 5620.436 |
| 0.8479166666666639 | 5480.557 |
| 0.8486111111111083 | 5342.375 |
| 0.8493055555555528 | 5205.837 |
| 0.8499999999999972 | 5070.891 |
| 0.8506944444444416 | 4937.481 |
| 0.8513888888888861 | 4805.552 |
| 0.8520833333333305 | 4675.045 |
| 0.852777777777775 | 4545.901 |
| 0.8534722222222194 | 4418.06 |
| 0.8541666666666639 | 4291.46 |
| 0.8548611111111083 | 4166.04 |
| 0.8555555555555527 | 4041.737 |
| 0.8562499999999972 | 3918.491 |
| 0.8569444444444416 | 3796.239 |
| 0.8576388888888861 | 3674.92 |
| 0.8583333333333305 | 3554.474 |
| 0.859027777777775 | 3434.844 |
| 0.8597222222222194 | 3315.971 |
| 0.8604166666666638 | 3197.802 |
| 0.8611111111111083 | 3080.284 |
| 0.8618055555555527 | 2963.368 |
| 0.8624999999999972 | 2847.007 |
| 0.8631944444444416 | 2731.157 |
| 0.863888888888886 | 2615.778 |
| 0.8645833333333305 | 2500.834 |
| 0.8652777777777749 | 2386.292 |
| 0.8659722222222194 | 2272.124 |
| 0.8666666666666638 | 2158.303 |
| 0.8673611111111083 | 2044.808 |
| 0.8680555555555527 | 1931.621 |
| 0.8687499999999971 | 1818.726 |
| 0.8694444444444416 | 1706.111 |
| 0.870138888888886 | 1593.766 |
| 0.8708333333333305 | 1481.685 |
| 0.8715277777777749 | 1369.863 |
| 0.8722222222222193 | 1258.295 |
| 0.8729166666666638 | 1146.98 |
| 0.8736111111111082 | 1035.918 |
| 0.8743055555555527 | 925.108 |
| 0.8749999999999971 | 814.55 |
| 0.8756944444444416 | 704.247 |
| 0.876388888888886 | 594.199 |
| 0.8770833333333304 | 484.409 |
| 0.8777777777777749 | 374.877 |
| 0.8784722222222193 | 265.607 |
| 0.8791666666666638 | 156.6 |
| 0.8798611111111082 | 47.859 |
| 0.8805555555555526 | 0 |
| 0.8812499999999971 | 0 |
| 0.8819444444444415 | 0 |
| 0.882638888888886 | 0 |
| 0.8833333333333304 | 0 |
| 0.8840277777777749 | 0 |
| 0.8847222222222193 | 0 |
| 0.8854166666666637 | 0 |
| 0.8861111111111082 | 0 |
| 0.8868055555555526 | 0 |
| 0.8874999999999971 | 0 |
| 0.8881944444444415 | 0 |
| 0.888888888888886 | 0 |
| 0.8895833333333304 | 0 |
| 0.8902777777777748 | 0 |
| 0.8909722222222193 | 0 |
| 0.8916666666666637 | 0 |
| 0.8923611111111082 | 0 |
| 0.8930555555555526 | 0 |
| 0.893749999999997 | 0 |
| 0.8944444444444415 | 0 |
| 0.8951388888888859 | 0 |
| 0.8958333333333304 | 0 |
| 0.8965277777777748 | 0 |
| 0.8972222222222193 | 0 |
| 0.8979166666666637 | 0 |
| 0.8986111111111081 | 0 |
| 0.8993055555555526 | 0 |
| 0.899999999999997 | 0 |
| 0.9006944444444415 | 0 |
| 0.9013888888888859 | 0 |
| 0.9020833333333304 | 0 |
| 0.9027777777777748 | 0 |
| 0.9034722222222192 | 0 |
| 0.9041666666666637 | 0 |
| 0.9048611111111081 | 0 |
| 0.9055555555555526 | 0 |
| 0.906249999999997 | 0 |
| 0.9069444444444414 | 0 |
| 0.9076388888888859 | 0 |
| 0.9083333333333303 | 0 |
| 0.9090277777777748 | 0 |
| 0.9097222222222192 | 0 |
| 0.9104166666666637 | 0 |
| 0.9111111111111081 | 0 |
| 0.9118055555555525 | 0 |
| 0.912499999999997 | 0 |
| 0.9131944444444414 | 0 |
| 0.9138888888888859 | 0 |
| 0.9145833333333303 | 0 |
| 0.9152777777777747 | 0 |
| 0.9159722222222192 | 0 |
| 0.9166666666666636 | 0 |
| 0.9173611111111081 | 0 |
| 0.9180555555555525 | 0 |
| 0.918749999999997 | 0 |
| 0.9194444444444414 | 0 |
| 0.9201388888888858 | 0 |
| 0.9208333333333303 | 0 |
| 0.9215277777777747 | 0 |
| 0.9222222222222192 | 0 |
| 0.9229166666666636 | 0 |
| 0.923611111111108 | 0 |
| 0.9243055555555525 | 0 |
| 0.9249999999999969 | 0 |
| 0.9256944444444414 | 0 |
| 0.9263888888888858 | 0 |
| 0.9270833333333303 | 0 |
| 0.9277777777777747 | 0 |
| 0.9284722222222191 | 0 |
| 0.9291666666666636 | 0 |
| 0.929861111111108 | 0 |
| 0.9305555555555525 | 0 |
| 0.9312499999999969 | 0 |
| 0.9319444444444414 | 0 |
| 0.9326388888888858 | 0 |
| 0.9333333333333302 | 0 |
| 0.9340277777777747 | 0 |
| 0.9347222222222191 | 0 |
| 0.9354166666666636 | 0 |
| 0.936111111111108 | 0 |
| 0.9368055555555524 | 0 |
| 0.9374999999999969 | 0 |
| 0.9381944444444413 | 0 |
| 0.9388888888888858 | 0 |
| 0.9395833333333302 | 0 |
| 0.9402777777777747 | 0 |
| 0.9409722222222191 | 0 |
| 0.9416666666666635 | 0 |
| 0.942361111111108 | 0 |
| 0.9430555555555524 | 0 |
| 0.9437499999999969 | 0 |
| 0.9444444444444413 | 0 |
| 0.9451388888888858 | 0 |
| 0.9458333333333302 | 0 |
| 0.9465277777777746 | 0 |
| 0.9472222222222191 | 0 |
| 0.9479166666666635 | 0 |
| 0.948611111111108 | 0 |
| 0.9493055555555524 | 0 |
| 0.9499999999999968 | 0 |
| 0.9506944444444413 | 0 |
| 0.9513888888888857 | 0 |
| 0.9520833333333302 | 0 |
| 0.9527777777777746 | 0 |
| 0.9534722222222191 | 0 |
| 0.9541666666666635 | 0 |
| 0.9548611111111079 | 0 |
| 0.9555555555555524 | 0 |
| 0.9562499999999968 | 0 |
| 0.9569444444444413 | 0 |
| 0.9576388888888857 | 0 |
| 0.9583333333333302 | 0 |
| 0.9590277777777746 | 0 |
| 0.959722222222219 | 0 |
| 0.9604166666666635 | 0 |
| 0.9611111111111079 | 0 |
| 0.9618055555555524 | 0 |
| 0.9624999999999968 | 0 |
| 0.9631944444444412 | 0 |
| 0.9638888888888857 | 0 |
| 0.9645833333333301 | 0 |
| 0.9652777777777746 | 0 |
| 0.965972222222219 | 0 |
| 0.9666666666666635 | 0 |
| 0.9673611111111079 | 0 |
| 0.9680555555555523 | 0 |
| 0.9687499999999968 | 0 |
| 0.9694444444444412 | 0 |
| 0.9701388888888857 | 0 |
| 0.9708333333333301 | 0 |
| 0.9715277777777745 | 0 |
| 0.972222222222219 | 0 |
| 0.9729166666666634 | 0 |
| 0.9736111111111079 | 0 |
| 0.9743055555555523 | 0 |
| 0.9749999999999968 | 0 |
| 0.9756944444444412 | 0 |
| 0.9763888888888856 | 0 |
| 0.9770833333333301 | 0 |
| 0.9777777777777745 | 0 |
| 0.978472222222219 | 0 |
| 0.9791666666666634 | 0 |
| 0.9798611111111079 | 0 |
| 0.9805555555555523 | 0 |
| 0.9812499999999967 | 0 |
| 0.9819444444444412 | 0 |
| 0.9826388888888856 | 0 |
| 0.9833333333333301 | 0 |
| 0.9840277777777745 | 0 |
| 0.984722222222219 | 0 |
| 0.9854166666666634 | 0 |
| 0.9861111111111078 | 0 |
| 0.9868055555555523 | 0 |
| 0.9874999999999967 | 0 |
| 0.9881944444444412 | 0 |
| 0.9888888888888856 | 0 |
| 0.98958333333333 | 0 |
| 0.9902777777777745 | 0 |
| 0.9909722222222189 | 0 |
| 0.9916666666666634 | 0 |
| 0.9923611111111078 | 0 |
| 0.9930555555555522 | 0 |
| 0.9937499999999967 | 0 |
| 0.9944444444444411 | 0 |
| 0.9951388888888856 | 0 |
| 0.99583333333333 | 0 |
| 0.9965277777777745 | 0 |
| 0.9972222222222189 | 0 |
| 0.9979166666666633 | 0 |
| 0.9986111111111078 | 0 |
| 0.9993055555555522 | 0 |